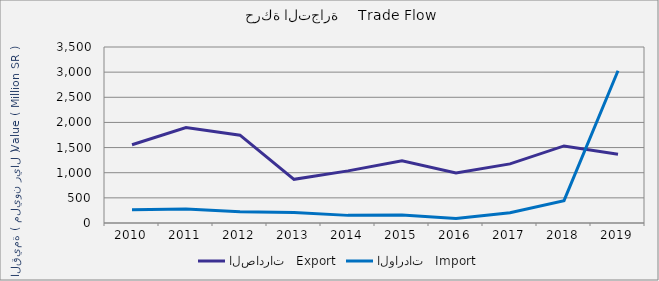
| Category | الصادرات   Export | الواردات   Import |
|---|---|---|
| 2010.0 | 1556322672 | 263137996 |
| 2011.0 | 1896759733 | 277292513 |
| 2012.0 | 1746605486 | 223005862 |
| 2013.0 | 867953017 | 209133826 |
| 2014.0 | 1036643266 | 151648168 |
| 2015.0 | 1238482647 | 160658555 |
| 2016.0 | 997079273 | 88090102 |
| 2017.0 | 1176085674 | 202313397 |
| 2018.0 | 1532796060 | 444279222 |
| 2019.0 | 1366917977 | 3027724113 |